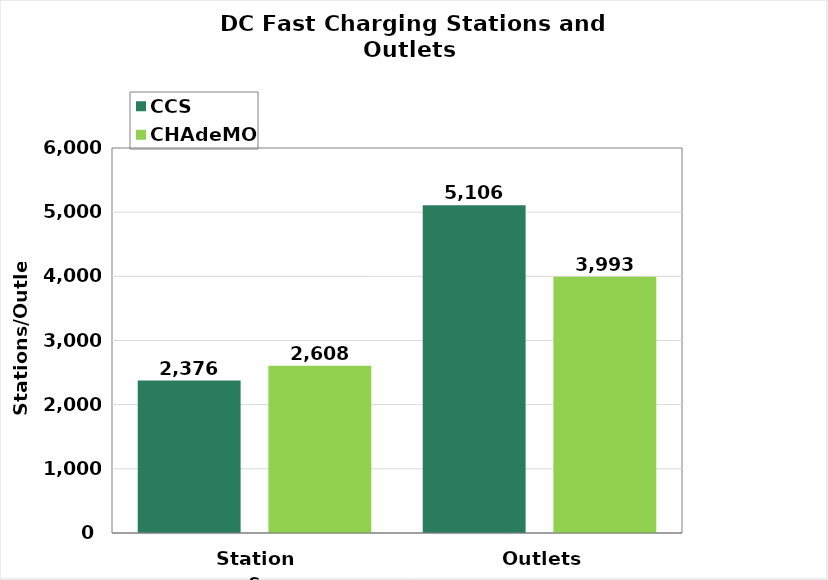
| Category | CCS | CHAdeMO |
|---|---|---|
| Stations | 2376 | 2608 |
| Outlets | 5106 | 3993 |